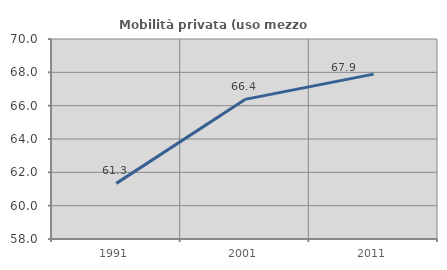
| Category | Mobilità privata (uso mezzo privato) |
|---|---|
| 1991.0 | 61.337 |
| 2001.0 | 66.377 |
| 2011.0 | 67.893 |